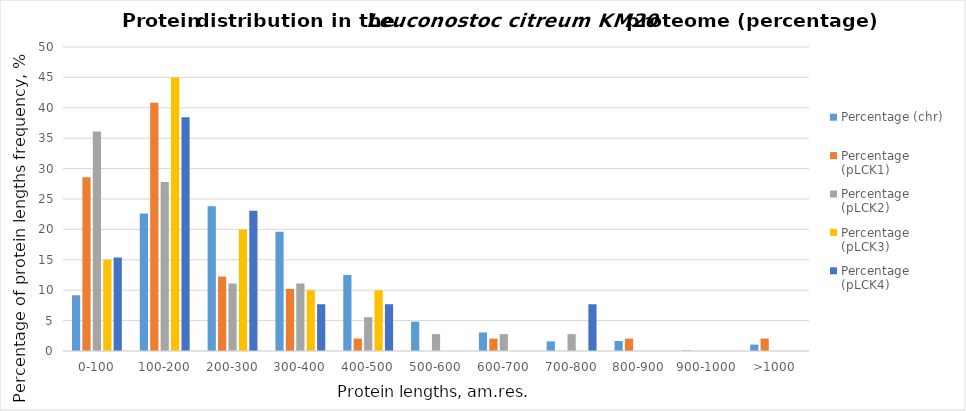
| Category | Percentage (chr) | Percentage (pLCK1) | Percentage (pLCK2) | Percentage (pLCK3) | Percentage (pLCK4) |
|---|---|---|---|---|---|
| 0-100 | 9.166 | 28.571 | 36.111 | 15 | 15.385 |
| 100-200 | 22.62 | 40.816 | 27.778 | 45 | 38.462 |
| 200-300 | 23.796 | 12.245 | 11.111 | 20 | 23.077 |
| 300-400 | 19.624 | 10.204 | 11.111 | 10 | 7.692 |
| 400-500 | 12.515 | 2.041 | 5.556 | 10 | 7.692 |
| 500-600 | 4.818 | 0 | 2.778 | 0 | 0 |
| 600-700 | 3.055 | 2.041 | 2.778 | 0 | 0 |
| 700-800 | 1.586 | 0 | 2.778 | 0 | 7.692 |
| 800-900 | 1.645 | 2.041 | 0 | 0 | 0 |
| 900-1000 | 0.118 | 0 | 0 | 0 | 0 |
| >1000 | 1.058 | 2.041 | 0 | 0 | 0 |